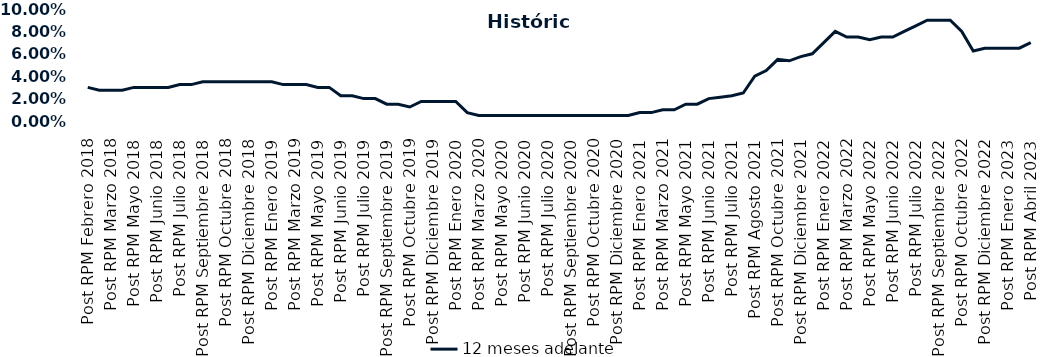
| Category | 12 meses adelante  |
|---|---|
| Post RPM Febrero 2018 | 0.03 |
| Pre RPM Marzo 2018 | 0.028 |
| Post RPM Marzo 2018 | 0.028 |
| Pre RPM Mayo 2018 | 0.028 |
| Post RPM Mayo 2018 | 0.03 |
| Pre RPM Junio 2018 | 0.03 |
| Post RPM Junio 2018 | 0.03 |
| Pre RPM Julio 2018 | 0.03 |
| Post RPM Julio 2018 | 0.032 |
| Pre RPM Septiembre 2018 | 0.032 |
| Post RPM Septiembre 2018 | 0.035 |
| Pre RPM Octubre 2018 | 0.035 |
| Post RPM Octubre 2018 | 0.035 |
| Pre RPM Diciembre 2018 | 0.035 |
| Post RPM Diciembre 2018 | 0.035 |
| Pre RPM Enero 2019 | 0.035 |
| Post RPM Enero 2019 | 0.035 |
| Pre RPM Marzo 2019 | 0.032 |
| Post RPM Marzo 2019 | 0.032 |
| Pre RPM Mayo 2019 | 0.032 |
| Post RPM Mayo 2019 | 0.03 |
| Pre RPM Junio 2019 | 0.03 |
| Post RPM Junio 2019 | 0.022 |
| Pre RPM Julio 2019 | 0.022 |
| Post RPM Julio 2019 | 0.02 |
| Pre RPM Septiembre 2019 | 0.02 |
| Post RPM Septiembre 2019 | 0.015 |
| Pre RPM Octubre 2019 | 0.015 |
| Post RPM Octubre 2019 | 0.012 |
| Pre RPM Diciembre 2019 | 0.018 |
| Post RPM Diciembre 2019 | 0.018 |
| Pre RPM Enero 2020 | 0.018 |
| Post RPM Enero 2020 | 0.018 |
| Pre RPM Marzo 2020 | 0.008 |
| Post RPM Marzo 2020 | 0.005 |
| Pre RPM Mayo 2020 | 0.005 |
| Post RPM Mayo 2020 | 0.005 |
| Pre RPM Junio 2020 | 0.005 |
| Post RPM Junio 2020 | 0.005 |
| Pre RPM Julio 2020 | 0.005 |
| Post RPM Julio 2020 | 0.005 |
| Pre RPM Septiembre 2020 | 0.005 |
| Post RPM Septiembre 2020 | 0.005 |
| Pre RPM Octubre 2020 | 0.005 |
| Post RPM Octubre 2020 | 0.005 |
| Pre RPM Diciembre 2020 | 0.005 |
| Post RPM Diciembre 2020 | 0.005 |
| Pre RPM Enero 2021 | 0.005 |
| Post RPM Enero 2021 | 0.008 |
| Pre RPM Marzo 2021 | 0.008 |
| Post RPM Marzo 2021 | 0.01 |
| Pre RPM Mayo 2021 | 0.01 |
| Post RPM Mayo 2021 | 0.015 |
| Pre RPM Junio 2021 | 0.015 |
| Post RPM Junio 2021 | 0.02 |
| Pre RPM Julio 2021 | 0.021 |
| Post RPM Julio 2021 | 0.022 |
| Pre RPM Agosto 2021 | 0.025 |
| Post RPM Agosto 2021 | 0.04 |
| Pre RPM Octubre 2021 | 0.045 |
| Post RPM Octubre 2021 | 0.055 |
| Pre RPM Diciembre 2021 | 0.054 |
| Post RPM Diciembre 2021 | 0.058 |
| Pre RPM Enero 2022 | 0.06 |
| Post RPM Enero 2022 | 0.07 |
| Pre RPM Marzo 2022 | 0.08 |
| Post RPM Marzo 2022 | 0.075 |
| Pre RPM Mayo 2022 | 0.075 |
| Post RPM Mayo 2022 | 0.072 |
| Pre RPM Junio 2022 | 0.075 |
| Post RPM Junio 2022 | 0.075 |
| Pre RPM Julio 2022 | 0.08 |
| Post RPM Julio 2022 | 0.085 |
| Pre RPM Septiembre 2022 | 0.09 |
| Post RPM Septiembre 2022 | 0.09 |
| Pre RPM Octubre 2022 | 0.09 |
| Post RPM Octubre 2022 | 0.08 |
| Pre RPM Diciembre 2022 | 0.062 |
| Post RPM Diciembre 2022 | 0.065 |
| Pre RPM Enero 2023 | 0.065 |
| Post RPM Enero 2023 | 0.065 |
| Pre RPM Abril 2023 | 0.065 |
| Post RPM Abril 2023 | 0.07 |